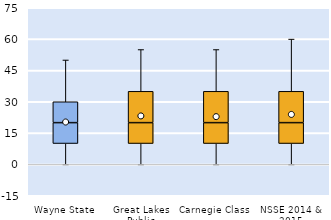
| Category | 25th | 50th | 75th |
|---|---|---|---|
| Wayne State | 10 | 10 | 10 |
| Great Lakes Public | 10 | 10 | 15 |
| Carnegie Class | 10 | 10 | 15 |
| NSSE 2014 & 2015 | 10 | 10 | 15 |